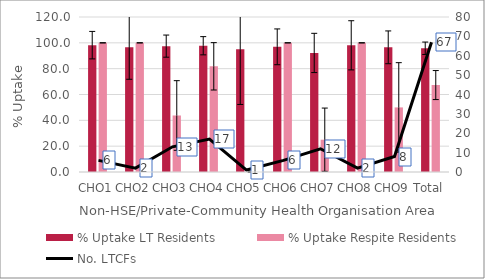
| Category | % Uptake LT Residents | % Uptake Respite Residents |
|---|---|---|
| 0 | 98.201 | 100 |
| 1 | 96.667 | 100 |
| 2 | 97.45 | 43.75 |
| 3 | 97.75 | 81.818 |
| 4 | 95 | 0 |
| 5 | 96.907 | 100 |
| 6 | 92.175 | 25 |
| 7 | 98.077 | 100 |
| 8 | 96.522 | 50 |
| 9 | 95.806 | 67.308 |